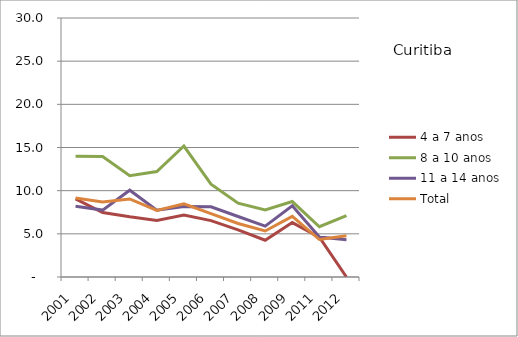
| Category | 4 a 7 anos | 8 a 10 anos | 11 a 14 anos | Total |
|---|---|---|---|---|
| 2001.0 | 9.05 | 14 | 8.2 | 9.15 |
| 2002.0 | 7.46 | 13.95 | 7.75 | 8.7 |
| 2003.0 | 6.97 | 11.74 | 10.05 | 9.04 |
| 2004.0 | 6.56 | 12.21 | 7.73 | 7.72 |
| 2005.0 | 7.19 | 15.17 | 8.16 | 8.47 |
| 2006.0 | 6.53 | 10.75 | 8.13 | 7.35 |
| 2007.0 | 5.45 | 8.55 | 7.01 | 6.2 |
| 2008.0 | 4.26 | 7.76 | 5.89 | 5.33 |
| 2009.0 | 6.3 | 8.74 | 8.24 | 7.03 |
| 2011.0 | 4.62 | 5.82 | 4.63 | 4.34 |
| 2012.0 | 0 | 7.12 | 4.32 | 4.79 |